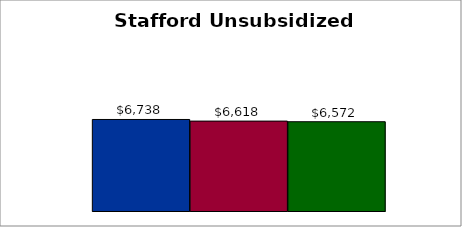
| Category | 50 states and D.C. | SREB states | State |
|---|---|---|---|
| 0 | 6738.491 | 6618.461 | 6572.396 |